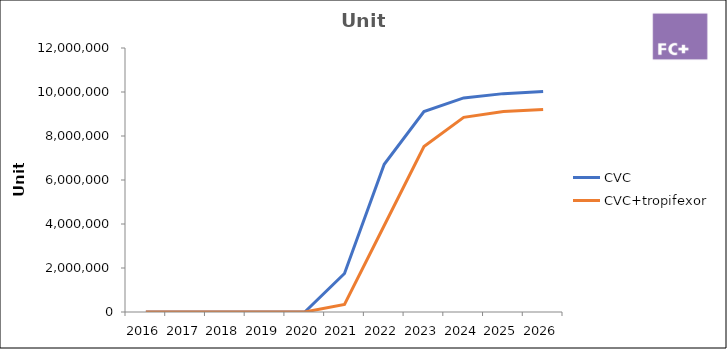
| Category | CVC | CVC+tropifexor |
|---|---|---|
| 2016.0 | 0 | 0 |
| 2017.0 | 0 | 0 |
| 2018.0 | 0 | 0 |
| 2019.0 | 0 | 0 |
| 2020.0 | 0 | 0 |
| 2021.0 | 1749185.427 | 341229.216 |
| 2022.0 | 6716944.913 | 3932916.919 |
| 2023.0 | 9110979.65 | 7524672.316 |
| 2024.0 | 9729357.45 | 8847132.851 |
| 2025.0 | 9925922.9 | 9110537.885 |
| 2026.0 | 10025182.129 | 9201643.263 |